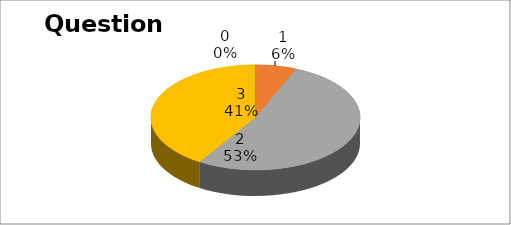
| Category | Series 0 |
|---|---|
| 0 | 0 |
| 1 | 6 |
| 2 | 50 |
| 3 | 39 |